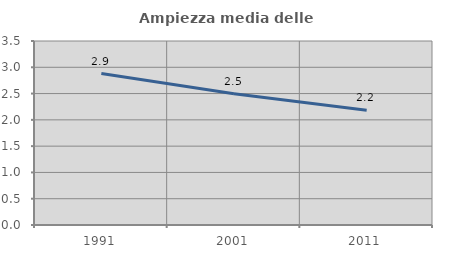
| Category | Ampiezza media delle famiglie |
|---|---|
| 1991.0 | 2.881 |
| 2001.0 | 2.495 |
| 2011.0 | 2.185 |